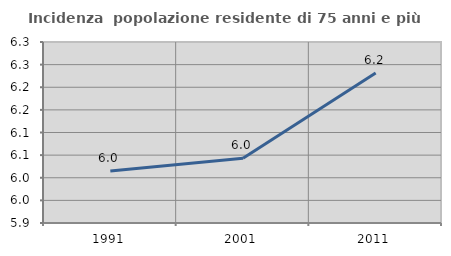
| Category | Incidenza  popolazione residente di 75 anni e più |
|---|---|
| 1991.0 | 6.015 |
| 2001.0 | 6.043 |
| 2011.0 | 6.231 |